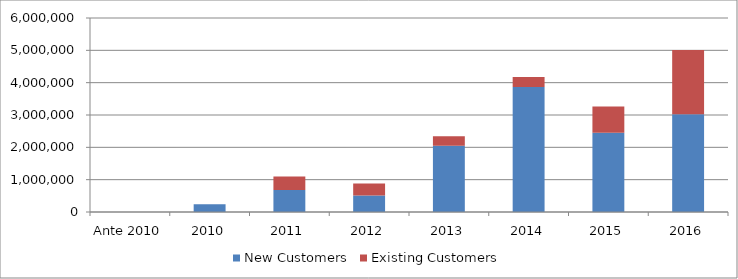
| Category | New Customers | Existing Customers |
|---|---|---|
| Ante 2010 | 0 | 0 |
| 2010 | 240000 | 0 |
| 2011 | 680000 | 415000 |
| 2012 | 510000 | 375000 |
| 2013 | 2050217.89 | 293000 |
| 2014 | 3866850.357 | 310576 |
| 2015 | 2450000 | 814958 |
| 2016 | 3022580.903 | 1990036.36 |